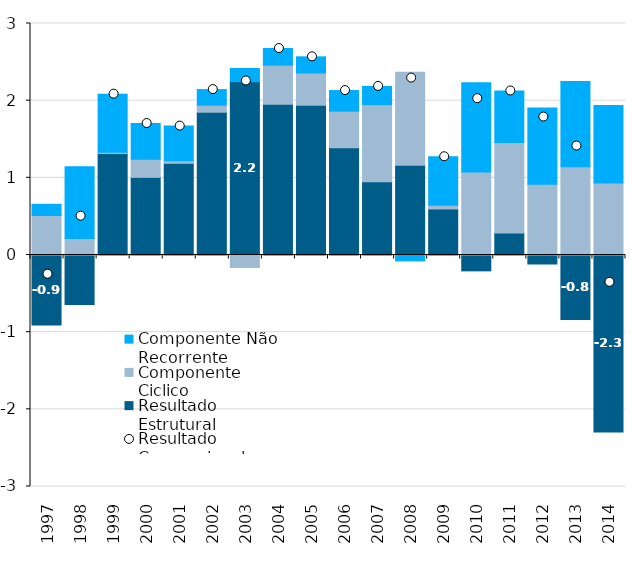
| Category | Resultado Estrutural | Componente Ciclico | Componente Não Recorrente |
|---|---|---|---|
| 0 | -0.907 | 0.512 | 0.145 |
| 1 | -0.641 | 0.214 | 0.93 |
| 2 | 1.314 | 0.018 | 0.752 |
| 3 | 1.006 | 0.236 | 0.462 |
| 4 | 1.188 | 0.034 | 0.449 |
| 5 | 1.85 | 0.091 | 0.203 |
| 6 | 2.246 | -0.162 | 0.171 |
| 7 | 1.955 | 0.504 | 0.216 |
| 8 | 1.94 | 0.419 | 0.209 |
| 9 | 1.391 | 0.473 | 0.267 |
| 10 | 0.95 | 0.999 | 0.237 |
| 11 | 1.164 | 1.206 | -0.077 |
| 12 | 0.597 | 0.049 | 0.628 |
| 13 | -0.206 | 1.077 | 1.154 |
| 14 | 0.286 | 1.173 | 0.667 |
| 15 | -0.116 | 0.916 | 0.988 |
| 16 | -0.835 | 1.144 | 1.103 |
| 17 | -2.292 | 0.933 | 1.005 |